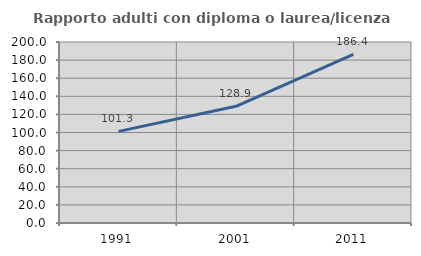
| Category | Rapporto adulti con diploma o laurea/licenza media  |
|---|---|
| 1991.0 | 101.274 |
| 2001.0 | 128.934 |
| 2011.0 | 186.441 |